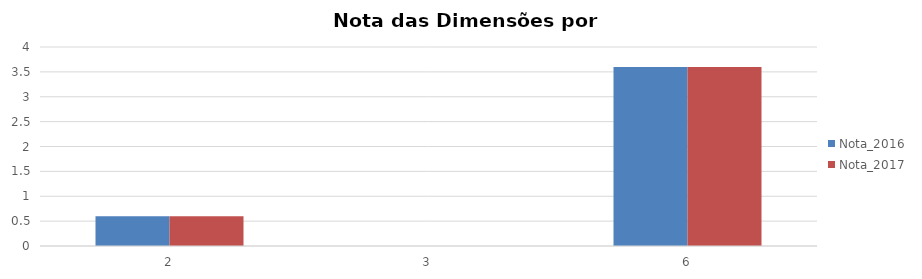
| Category | Nota_2016 | Nota_2017 |
|---|---|---|
| 2 | 0.6 | 0.6 |
| 3 | 0 | 0 |
| 6 | 3.6 | 3.6 |